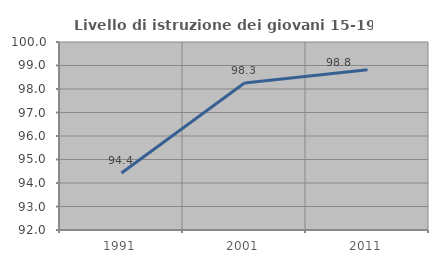
| Category | Livello di istruzione dei giovani 15-19 anni |
|---|---|
| 1991.0 | 94.428 |
| 2001.0 | 98.253 |
| 2011.0 | 98.821 |